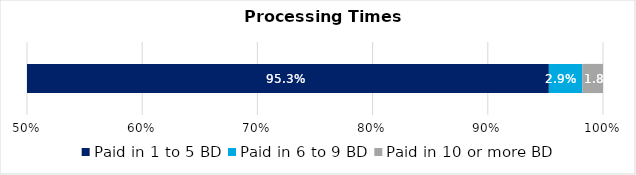
| Category | Paid in 1 to 5 BD | Paid in 6 to 9 BD | Paid in 10 or more BD |
|---|---|---|---|
| 0 | 0.953 | 0.029 | 0.018 |